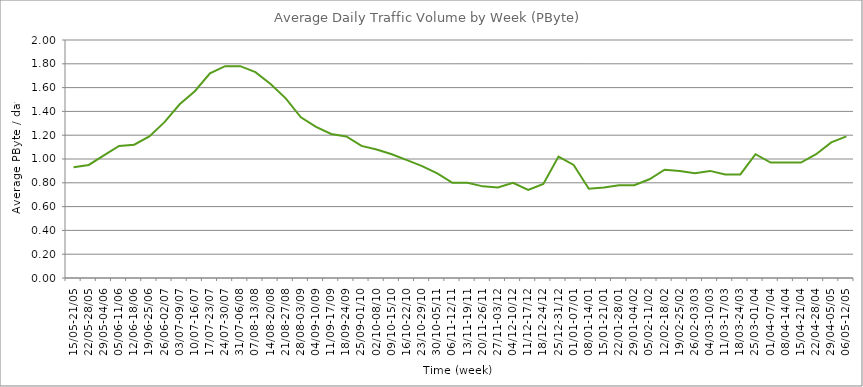
| Category | Average |
|---|---|
| 15/05-21/05 | 0.93 |
| 22/05-28/05 | 0.95 |
| 29/05-04/06 | 1.03 |
| 05/06-11/06 | 1.11 |
| 12/06-18/06 | 1.12 |
| 19/06-25/06 | 1.19 |
| 26/06-02/07 | 1.31 |
| 03/07-09/07 | 1.46 |
| 10/07-16/07 | 1.57 |
| 17/07-23/07 | 1.72 |
| 24/07-30/07 | 1.78 |
| 31/07-06/08 | 1.78 |
| 07/08-13/08 | 1.73 |
| 14/08-20/08 | 1.63 |
| 21/08-27/08 | 1.51 |
| 28/08-03/09 | 1.35 |
| 04/09-10/09 | 1.27 |
| 11/09-17/09 | 1.21 |
| 18/09-24/09 | 1.19 |
| 25/09-01/10 | 1.11 |
| 02/10-08/10 | 1.08 |
| 09/10-15/10 | 1.04 |
| 16/10-22/10 | 0.99 |
| 23/10-29/10 | 0.94 |
| 30/10-05/11 | 0.88 |
| 06/11-12/11 | 0.8 |
| 13/11-19/11 | 0.8 |
| 20/11-26/11 | 0.77 |
| 27/11-03/12 | 0.76 |
| 04/12-10/12 | 0.8 |
| 11/12-17/12 | 0.74 |
| 18/12-24/12 | 0.79 |
| 25/12-31/12 | 1.02 |
| 01/01-07/01 | 0.95 |
| 08/01-14/01 | 0.75 |
| 15/01-21/01 | 0.76 |
| 22/01-28/01 | 0.78 |
| 29/01-04/02 | 0.78 |
| 05/02-11/02 | 0.83 |
| 12/02-18/02 | 0.91 |
| 19/02-25/02 | 0.9 |
| 26/02-03/03 | 0.88 |
| 04/03-10/03 | 0.9 |
| 11/03-17/03 | 0.87 |
| 18/03-24/03 | 0.87 |
| 25/03-01/04 | 1.04 |
| 01/04-07/04 | 0.97 |
| 08/04-14/04 | 0.97 |
| 15/04-21/04 | 0.97 |
| 22/04-28/04 | 1.04 |
| 29/04-05/05 | 1.14 |
| 06/05-12/05 | 1.19 |